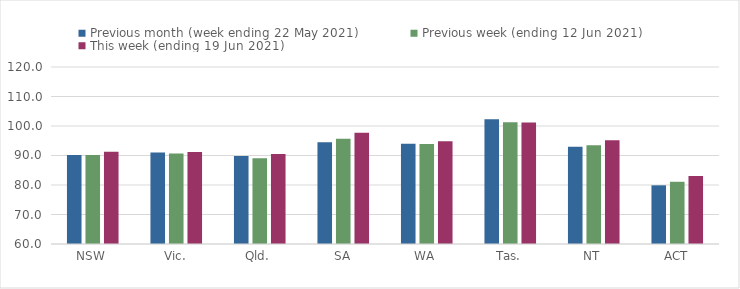
| Category | Previous month (week ending 22 May 2021) | Previous week (ending 12 Jun 2021) | This week (ending 19 Jun 2021) |
|---|---|---|---|
| NSW | 90.16 | 90.19 | 91.27 |
| Vic. | 90.99 | 90.67 | 91.21 |
| Qld. | 89.79 | 89.07 | 90.5 |
| SA | 94.53 | 95.72 | 97.71 |
| WA | 93.99 | 93.91 | 94.85 |
| Tas. | 102.26 | 101.23 | 101.21 |
| NT | 92.99 | 93.49 | 95.15 |
| ACT | 79.89 | 81.09 | 83.04 |